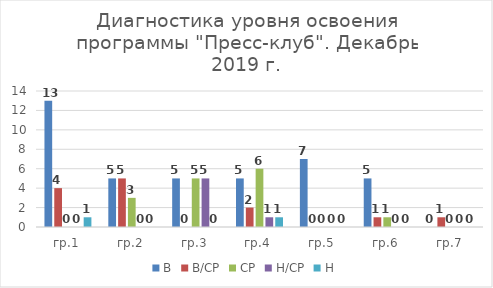
| Category | В | В/СР | СР | Н/СР | Н |
|---|---|---|---|---|---|
| гр.1 | 13 | 4 | 0 | 0 | 1 |
| гр.2 | 5 | 5 | 3 | 0 | 0 |
| гр.3 | 5 | 0 | 5 | 5 | 0 |
| гр.4 | 5 | 2 | 6 | 1 | 1 |
| гр.5 | 7 | 0 | 0 | 0 | 0 |
| гр.6 | 5 | 1 | 1 | 0 | 0 |
| гр.7 | 0 | 1 | 0 | 0 | 0 |